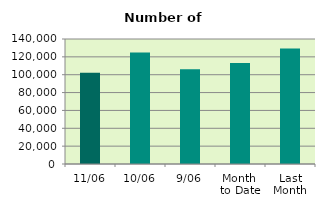
| Category | Series 0 |
|---|---|
| 11/06 | 102072 |
| 10/06 | 125006 |
| 9/06 | 106034 |
| Month 
to Date | 112983.778 |
| Last
Month | 129378.19 |